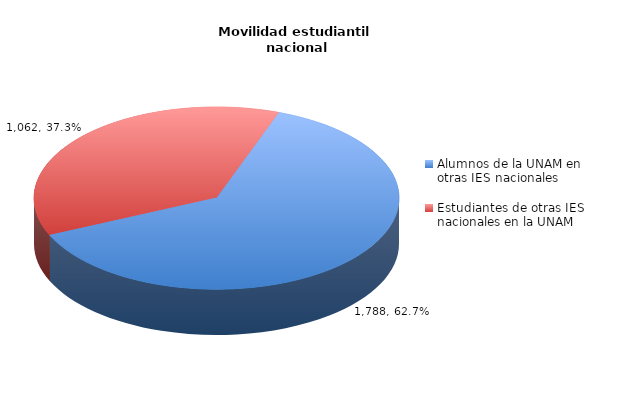
| Category | Series 0 |
|---|---|
| Alumnos de la UNAM en otras IES nacionales | 1788 |
| Estudiantes de otras IES nacionales en la UNAM | 1062 |